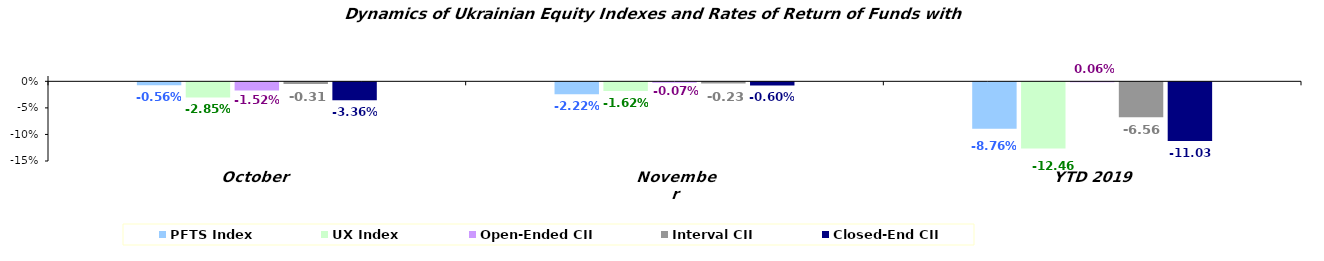
| Category | PFTS Index | UX Index | Open-Ended CII | Interval CII | Closed-End CII |
|---|---|---|---|---|---|
| October | -0.006 | -0.029 | -0.015 | -0.003 | -0.034 |
| November | -0.022 | -0.016 | -0.001 | -0.002 | -0.006 |
| YTD 2019 | -0.088 | -0.125 | 0.001 | -0.066 | -0.11 |